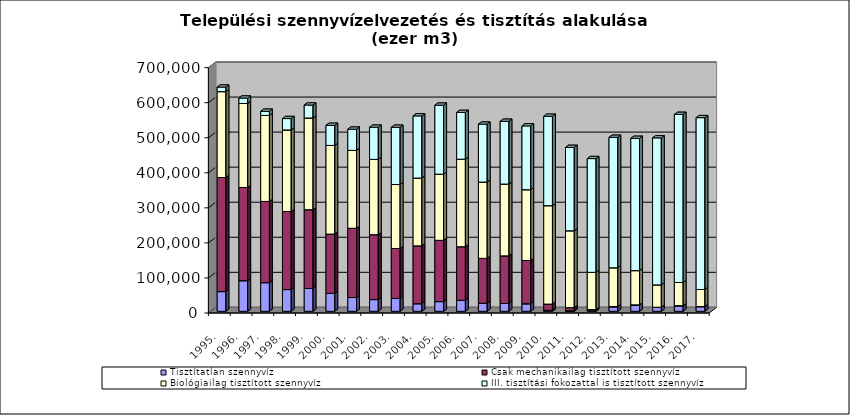
| Category | Tisztítatlan szennyvíz | Csak mechanikailag tisztított szennyvíz  | Biológiailag tisztított szennyvíz  | III. tisztítási fokozattal is tisztított szennyvíz  |
|---|---|---|---|---|
| 1995. | 56252.9 | 325450.9 | 244992.3 | 13000.7 |
| 1996. | 87388.3 | 265887.8 | 239665.2 | 15431 |
| 1997. | 81832.4 | 231634.1 | 245385.9 | 11762.4 |
| 1998. | 62074 | 222592.6 | 232776.6 | 32400.2 |
| 1999. | 65191.4 | 224673.3 | 261597.3 | 36997.9 |
| 2000. | 51291.2 | 168910 | 252978.1 | 57304.3 |
| 2001. | 39335.7 | 197628.8 | 222229.4 | 60355.4 |
| 2002. | 33511.4 | 185064.4 | 214865.1 | 91737.6 |
| 2003. | 36793.6 | 142450.5 | 182455.4 | 163382.5 |
| 2004. | 21621.2 | 165074.2 | 193403.7 | 177357.3 |
| 2005. | 27686.1 | 174815.2 | 188778.9 | 196783.8 |
| 2006. | 31344.5 | 152939.3 | 249641.1 | 133378.5 |
| 2007. | 22906.3 | 128143.3 | 217654.1 | 165185.7 |
| 2008. | 22319.2 | 135844.8 | 204819.6 | 179122.6 |
| 2009. | 21496.8 | 123511.7 | 201940.7 | 182073 |
| 2010. | 2963.7 | 17607.4 | 280759.7 | 255007.6 |
| 2011. | 1631.1 | 8930.3 | 219184.3 | 237848.3 |
| 2012. | 4044.3 | 831.3 | 106292.7 | 324523.3 |
| 2013. | 12892.1 | 562.2 | 110808.1 | 372068.4 |
| 2014. | 17874.4 | 638.9 | 97569.6 | 377276.5 |
| 2015. | 10873.71 | 746.35 | 63722.37 | 419514.07 |
| 2016. | 15719.1 | 498.58 | 66023.36 | 479554.56 |
| 2017. | 13220.46 | 510.84 | 48537.73 | 490235.47 |